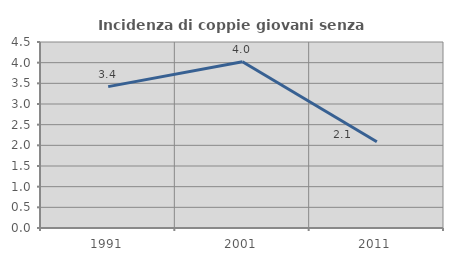
| Category | Incidenza di coppie giovani senza figli |
|---|---|
| 1991.0 | 3.42 |
| 2001.0 | 4.023 |
| 2011.0 | 2.087 |